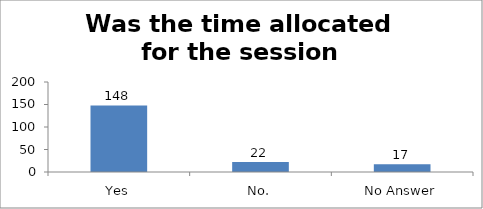
| Category | Was the time allocated for the session sufficient? |
|---|---|
| Yes | 148 |
| No. | 22 |
| No Answer | 17 |